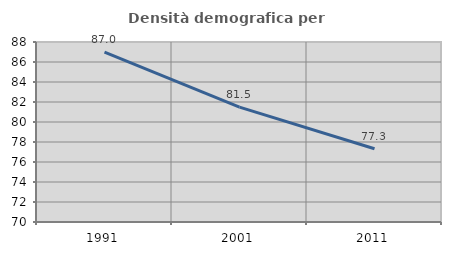
| Category | Densità demografica |
|---|---|
| 1991.0 | 86.987 |
| 2001.0 | 81.485 |
| 2011.0 | 77.322 |